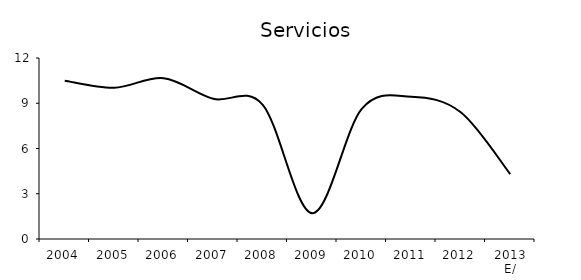
| Category | Servicios |
|---|---|
| 2004 | 10.496 |
| 2005 | 10.025 |
| 2006 | 10.661 |
| 2007 | 9.297 |
| 2008 | 8.895 |
| 2009 | 1.71 |
| 2010 | 8.632 |
| 2011 | 9.432 |
| 2012 | 8.4 |
| 2013 E/ | 4.303 |